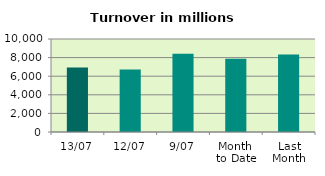
| Category | Series 0 |
|---|---|
| 13/07 | 6938.006 |
| 12/07 | 6722.274 |
| 9/07 | 8409.387 |
| Month 
to Date | 7888.585 |
| Last
Month | 8344.334 |